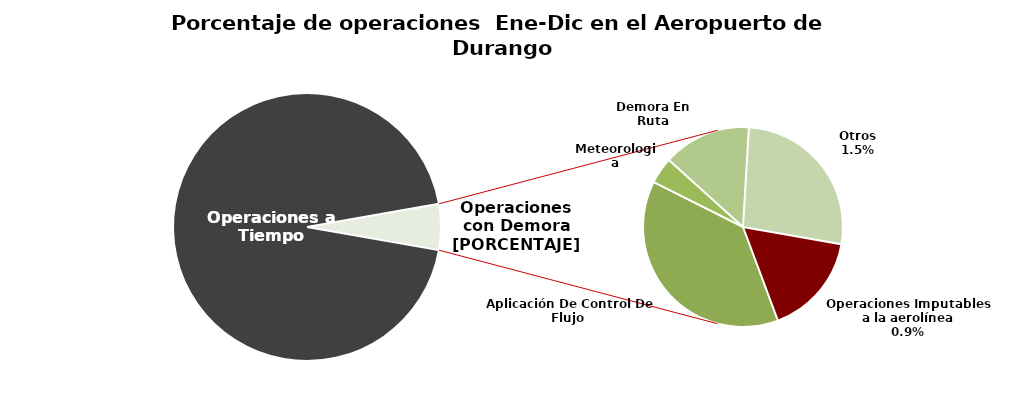
| Category | Series 0 |
|---|---|
| Operaciones a Tiempo | 5160 |
| Operaciones Imputables a la aerolínea | 50 |
| Aplicación De Control De Flujo  | 115 |
| Meteorologia | 13 |
| Demora En Ruta | 43 |
| Otros | 81 |